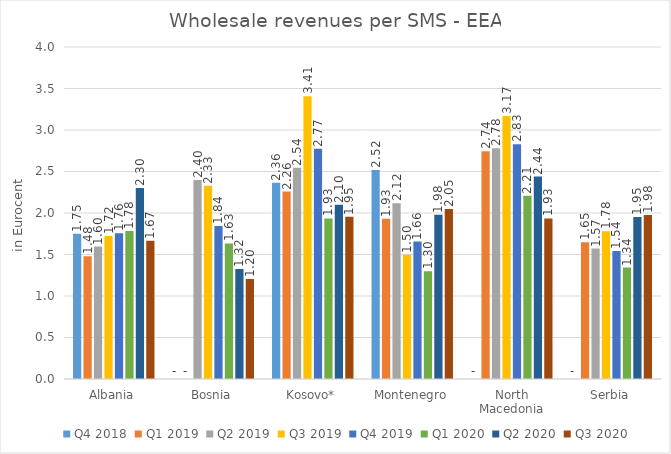
| Category | Q4 2018 | Q1 2019 | Q2 2019 | Q3 2019 | Q4 2019 | Q1 2020 | Q2 2020 | Q3 2020 |
|---|---|---|---|---|---|---|---|---|
| Albania | 1.75 | 1.48 | 1.596 | 1.724 | 1.757 | 1.782 | 2.301 | 1.667 |
| Bosnia | 0 | 0 | 2.396 | 2.327 | 1.843 | 1.634 | 1.324 | 1.204 |
| Kosovo* | 2.363 | 2.259 | 2.544 | 3.408 | 2.774 | 1.934 | 2.101 | 1.954 |
| Montenegro | 2.518 | 1.931 | 2.118 | 1.498 | 1.656 | 1.298 | 1.979 | 2.047 |
| North Macedonia | 0 | 2.745 | 2.78 | 3.169 | 2.829 | 2.208 | 2.438 | 1.935 |
| Serbia | 0 | 1.649 | 1.572 | 1.781 | 1.542 | 1.342 | 1.951 | 1.976 |